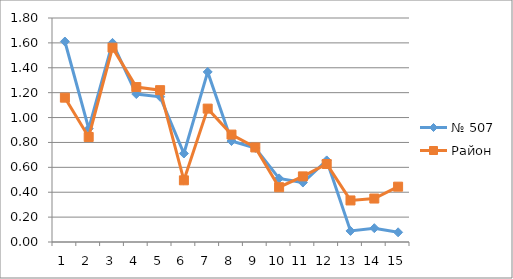
| Category | № 507 | Район |
|---|---|---|
| 0 | 1.611 | 1.16 |
| 1 | 0.911 | 0.844 |
| 2 | 1.6 | 1.562 |
| 3 | 1.189 | 1.245 |
| 4 | 1.167 | 1.22 |
| 5 | 0.711 | 0.496 |
| 6 | 1.367 | 1.072 |
| 7 | 0.811 | 0.863 |
| 8 | 0.756 | 0.76 |
| 9 | 0.511 | 0.44 |
| 10 | 0.478 | 0.527 |
| 11 | 0.656 | 0.627 |
| 12 | 0.089 | 0.334 |
| 13 | 0.111 | 0.349 |
| 14 | 0.078 | 0.445 |